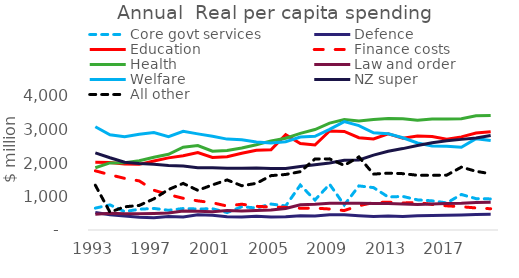
| Category |  Core govt services  |  Defence  |  Education  |  Finance costs  |  Health  |  Law and order  |  Welfare  |  NZ super  |  All other  |
|---|---|---|---|---|---|---|---|---|---|
| 1993-06-01 | 652.962 | 523.172 | 2024.449 | 1766.654 | 1858.978 | 470.097 | 3081.921 | 2301.89 | 1337.59 |
| 1994-06-01 | 750.128 | 456.694 | 2014.418 | 1649.15 | 2003.534 | 500.666 | 2840.771 | 2156.745 | 531.576 |
| 1995-06-01 | 549.718 | 415.57 | 1970.368 | 1541.26 | 2004.418 | 488.182 | 2785.078 | 2024.54 | 692.07 |
| 1996-06-01 | 619.549 | 384.002 | 1959.2 | 1465.936 | 2069.65 | 488.513 | 2858.281 | 1987.264 | 733.958 |
| 1997-06-01 | 644.107 | 365.522 | 2061.376 | 1186.982 | 2173.814 | 494.962 | 2910.842 | 1965.365 | 929.648 |
| 1998-06-01 | 588.426 | 401.199 | 2152.537 | 1056.303 | 2260.654 | 506.679 | 2788.806 | 1923.496 | 1209.625 |
| 1999-06-01 | 641.259 | 387.388 | 2218.643 | 946.28 | 2472.138 | 563.781 | 2946.782 | 1907.228 | 1390.46 |
| 2000-06-01 | 626.835 | 457.113 | 2313.058 | 869.871 | 2519.803 | 561.219 | 2869.511 | 1857.777 | 1184.022 |
| 2001-06-01 | 634.687 | 438.421 | 2165.983 | 813.303 | 2350.953 | 543.967 | 2800.669 | 1861.347 | 1345.267 |
| 2002-06-01 | 519.933 | 392.313 | 2185.405 | 715.076 | 2374.134 | 585.093 | 2712.765 | 1840.021 | 1494.637 |
| 2003-06-01 | 694.8 | 391.11 | 2288.599 | 769.825 | 2446.805 | 565.626 | 2696.02 | 1840.404 | 1321.098 |
| 2004-06-01 | 656.471 | 411.59 | 2381.317 | 707.017 | 2546.455 | 578.611 | 2625.571 | 1848.856 | 1393 |
| 2005-06-01 | 774.807 | 384.838 | 2393.542 | 686.37 | 2660.062 | 596.725 | 2595.469 | 1836.055 | 1622.96 |
| 2006-06-01 | 718.917 | 396.594 | 2842.975 | 675.615 | 2737.733 | 640.917 | 2633.638 | 1839.302 | 1657.494 |
| 2007-06-01 | 1341.399 | 422.53 | 2581.692 | 648.696 | 2884.175 | 751.752 | 2773.599 | 1896.787 | 1740.811 |
| 2008-06-01 | 895.036 | 414.727 | 2535.891 | 653.156 | 2999.472 | 768.387 | 2795.56 | 1950.971 | 2120.102 |
| 2009-06-01 | 1365.612 | 453.312 | 2955.43 | 626.69 | 3190.987 | 796.973 | 3002.645 | 1997.979 | 2123.111 |
| 2010-06-01 | 746.394 | 455.265 | 2942.41 | 579.999 | 3294.777 | 800.856 | 3236.3 | 2080.568 | 1928.98 |
| 2011-06-01 | 1316.101 | 427.975 | 2756.172 | 725.358 | 3253.702 | 800.118 | 3116.958 | 2089.012 | 2181.752 |
| 2012-06-01 | 1265.14 | 404.621 | 2716.275 | 818.332 | 3300.366 | 793.16 | 2900.406 | 2233.807 | 1667.897 |
| 2013-06-01 | 986.388 | 414.402 | 2872.331 | 831.331 | 3330.379 | 793.888 | 2872.791 | 2351.113 | 1697.579 |
| 2014-06-01 | 1002.472 | 403.26 | 2738.872 | 806.075 | 3317.375 | 779.577 | 2754.014 | 2430.025 | 1682.068 |
| 2015-06-01 | 899.527 | 426.699 | 2802.372 | 823.152 | 3276.505 | 764.837 | 2596.312 | 2522.113 | 1634.118 |
| 2016-06-01 | 870.441 | 429.915 | 2792.116 | 761.795 | 3315.824 | 774.103 | 2506.921 | 2603.047 | 1633.509 |
| 2017-06-01 | 807.919 | 438.159 | 2711.643 | 721.553 | 3312.325 | 792.606 | 2501.344 | 2663.05 | 1637.889 |
| 2018-06-01 | 1060.362 | 448.249 | 2779.938 | 695.232 | 3320.014 | 801.703 | 2472.002 | 2705.329 | 1876.513 |
| 2019-06-01 | 936.313 | 466.255 | 2894.508 | 657.929 | 3409.252 | 822.982 | 2727.173 | 2745.048 | 1752.259 |
| 2020-06-01 | 928.164 | 468.586 | 2934.683 | 634.586 | 3421.1 | 831.285 | 2672.171 | 2822.545 | 1677.277 |